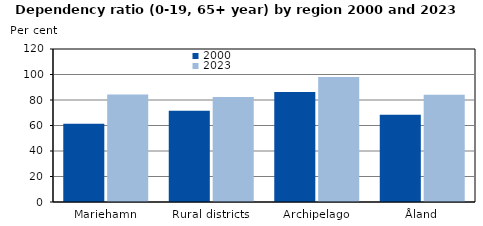
| Category | 2000 | 2023 |
|---|---|---|
| Mariehamn | 61.428 | 84.246 |
| Rural districts | 71.595 | 82.308 |
| Archipelago | 86.201 | 98.064 |
| Åland | 68.482 | 84.037 |